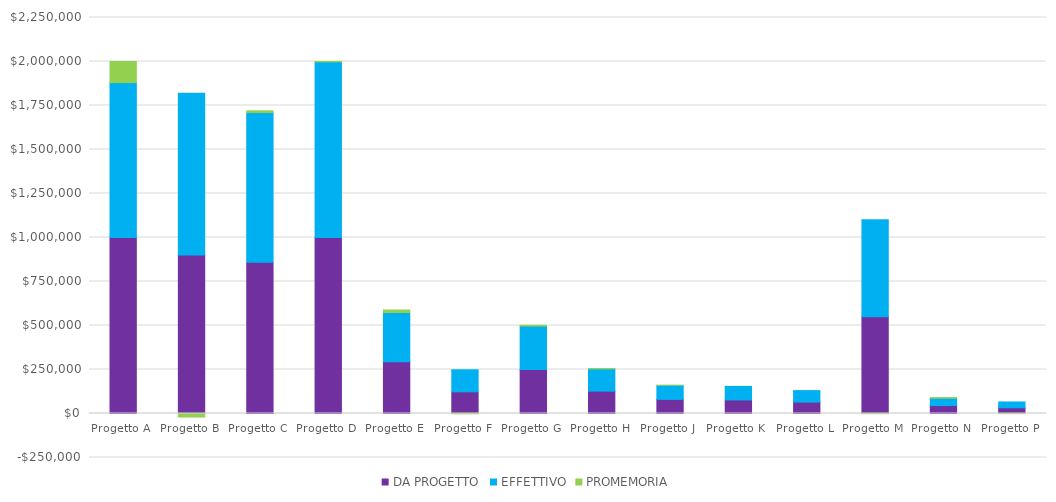
| Category | DA PROGETTO | EFFETTIVO | PROMEMORIA |
|---|---|---|---|
| Progetto A | 1000000 | 880000 | 120000 |
| Progetto B | 900000 | 920000 | -20000 |
| Progetto C | 860000 | 850000 | 10000 |
| Progetto D | 1000000 | 998050 | 1950 |
| Progetto E | 294000 | 280000 | 14000 |
| Progetto F | 123400 | 125000 | -1600 |
| Progetto G | 250500 | 246000 | 4500 |
| Progetto H | 127200 | 126000 | 1200 |
| Progetto J | 80000 | 79900 | 100 |
| Progetto K | 77000 | 77000 | 0 |
| Progetto L | 65000 | 65000 | 0 |
| Progetto M | 550000 | 551000 | -1000 |
| Progetto N | 45000 | 42000 | 3000 |
| Progetto P | 32500 | 33000 | -500 |